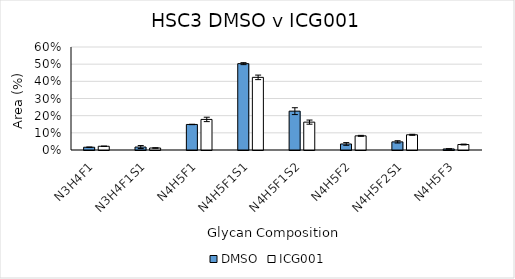
| Category | DMSO | ICG001 |
|---|---|---|
| N3H4F1 | 0.016 | 0.022 |
| N3H4F1S1 | 0.017 | 0.012 |
| N4H5F1 | 0.149 | 0.178 |
| N4H5F1S1 | 0.503 | 0.423 |
| N4H5F1S2 | 0.226 | 0.162 |
| N4H5F2 | 0.035 | 0.082 |
| N4H5F2S1 | 0.047 | 0.089 |
| N4H5F3 | 0.006 | 0.032 |